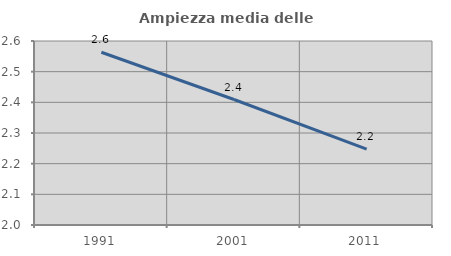
| Category | Ampiezza media delle famiglie |
|---|---|
| 1991.0 | 2.563 |
| 2001.0 | 2.409 |
| 2011.0 | 2.247 |